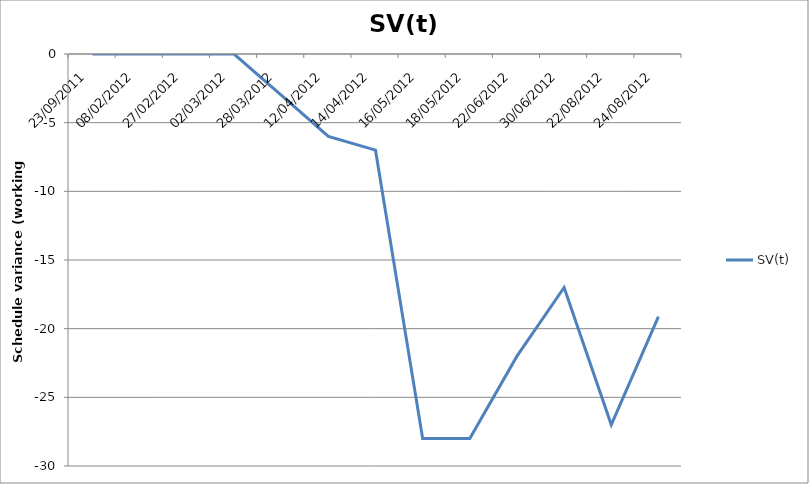
| Category | SV(t) |
|---|---|
| 23/09/2011 | 0 |
| 08/02/2012 | 0 |
| 27/02/2012 | 0 |
| 02/03/2012 | 0 |
| 28/03/2012 | -3 |
| 12/04/2012 | -6 |
| 14/04/2012 | -7 |
| 16/05/2012 | -28 |
| 18/05/2012 | -28 |
| 22/06/2012 | -22 |
| 30/06/2012 | -17 |
| 22/08/2012 | -27 |
| 24/08/2012 | -19.125 |